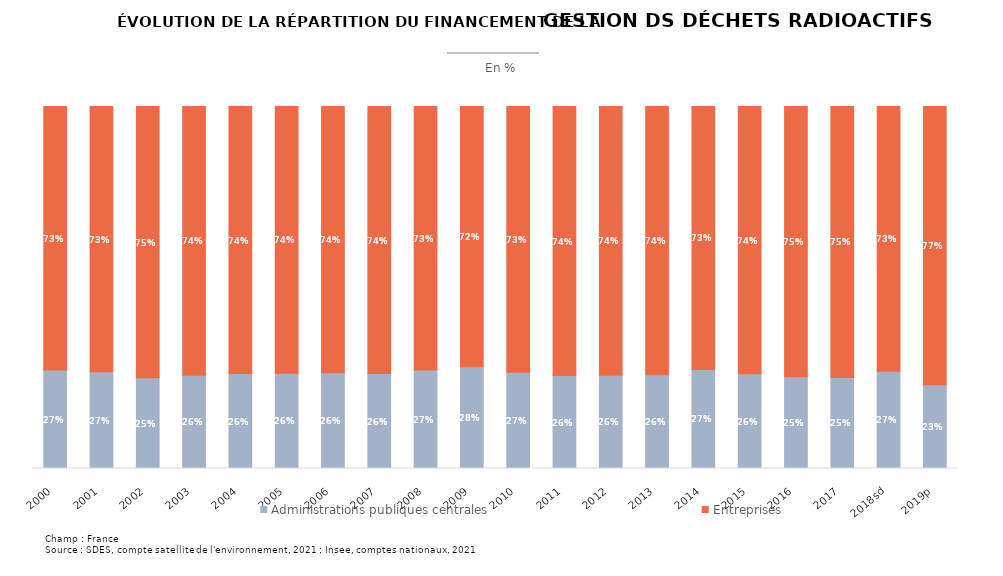
| Category | Administrations publiques centrales | Entreprises |
|---|---|---|
| 2000 | 0.272 | 0.728 |
| 2001 | 0.267 | 0.733 |
| 2002 | 0.251 | 0.749 |
| 2003 | 0.258 | 0.742 |
| 2004 | 0.262 | 0.738 |
| 2005 | 0.263 | 0.737 |
| 2006 | 0.265 | 0.735 |
| 2007 | 0.262 | 0.738 |
| 2008 | 0.272 | 0.728 |
| 2009 | 0.281 | 0.719 |
| 2010 | 0.266 | 0.734 |
| 2011 | 0.257 | 0.743 |
| 2012 | 0.257 | 0.743 |
| 2013 | 0.259 | 0.741 |
| 2014 | 0.273 | 0.727 |
| 2015 | 0.262 | 0.738 |
| 2016 | 0.253 | 0.747 |
| 2017 | 0.252 | 0.748 |
| 2018sd | 0.269 | 0.731 |
| 2019p | 0.231 | 0.769 |